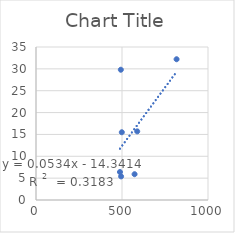
| Category | Series 0 |
|---|---|
| 498.9 | 15.5 |
| 488.1 | 6.4 |
| 817.3 | 32.2 |
| 494.7 | 5.4 |
| 573.1 | 5.9 |
| 493.2 | 29.8 |
| 588.5 | 15.7 |